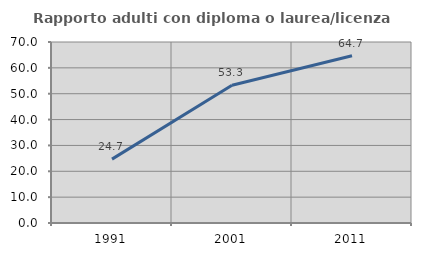
| Category | Rapporto adulti con diploma o laurea/licenza media  |
|---|---|
| 1991.0 | 24.712 |
| 2001.0 | 53.272 |
| 2011.0 | 64.69 |